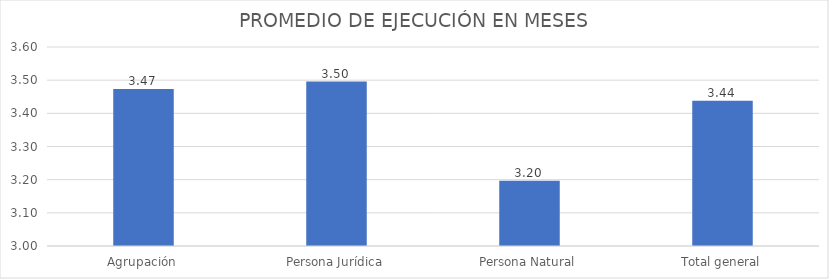
| Category | PROMEDIO EN MESES |
|---|---|
| Agrupación | 3.473 |
| Persona Jurídica | 3.496 |
| Persona Natural | 3.197 |
| Total general | 3.438 |